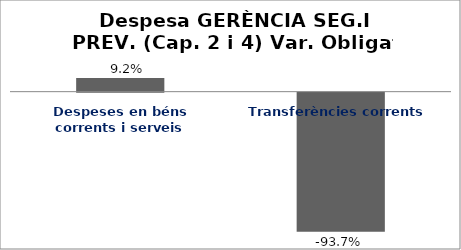
| Category | Series 0 |
|---|---|
| Despeses en béns corrents i serveis | 0.092 |
| Transferències corrents | -0.937 |